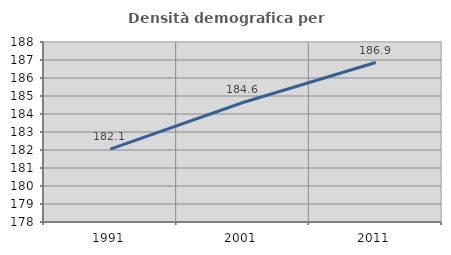
| Category | Densità demografica |
|---|---|
| 1991.0 | 182.053 |
| 2001.0 | 184.641 |
| 2011.0 | 186.861 |